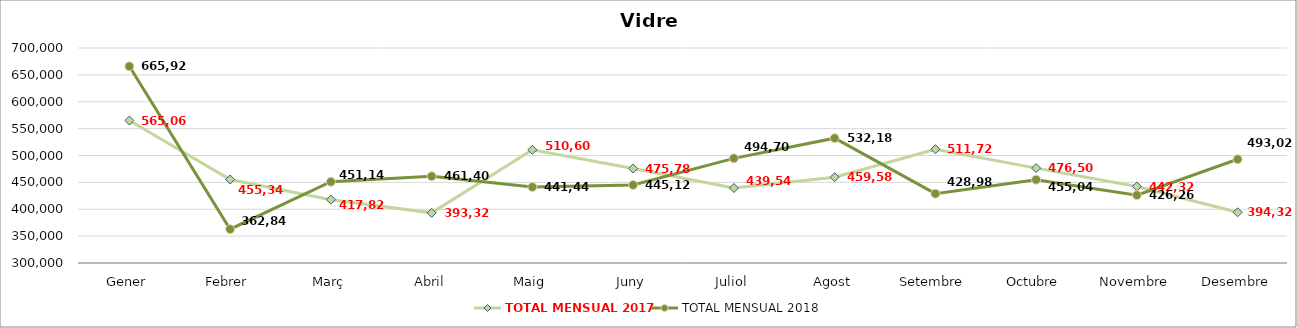
| Category | TOTAL MENSUAL 2017 | TOTAL MENSUAL 2018 |
|---|---|---|
| Gener | 565059.97 | 665919.99 |
| Febrer | 455340.13 | 362839.65 |
| Març | 417820 | 451140.37 |
| Abril | 393320 | 461399.98 |
| Maig | 510600.33 | 441439.95 |
| Juny | 475780.11 | 445120.03 |
| Juliol | 439540.03 | 494700 |
| Agost | 459579.99 | 532180.97 |
| Setembre | 511720.01 | 428980 |
| Octubre | 476500.01 | 455039.99 |
| Novembre | 442320.02 | 426259.8 |
| Desembre | 394320 | 493020.04 |